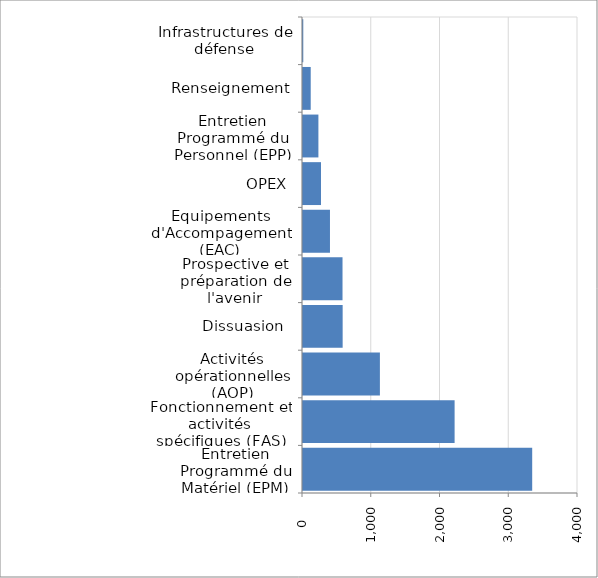
| Category | Series 0 |
|---|---|
| Entretien Programmé du Matériel (EPM) | 3333.786 |
| Fonctionnement et activités spécifiques (FAS) | 2205.2 |
| Activités opérationnelles (AOP) | 1118.565 |
| Dissuasion  | 576.755 |
| Prospective et préparation de l'avenir | 574.788 |
| Equipements d'Accompagement (EAC) | 392.265 |
| OPEX | 262 |
| Entretien Programmé du Personnel (EPP) | 224.041 |
| Renseignement | 112.365 |
| Infrastructures de défense | 4 |